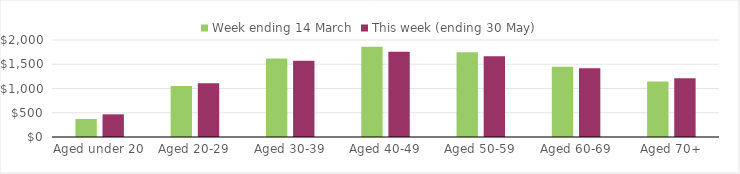
| Category | Week ending 14 March | This week (ending 30 May) |
|---|---|---|
| Aged under 20 | 370.68 | 467.66 |
| Aged 20-29 | 1052.04 | 1108.65 |
| Aged 30-39 | 1617.01 | 1574.1 |
| Aged 40-49 | 1859.57 | 1756.61 |
| Aged 50-59 | 1748.86 | 1663.41 |
| Aged 60-69 | 1447.88 | 1419.62 |
| Aged 70+ | 1142.88 | 1212.06 |